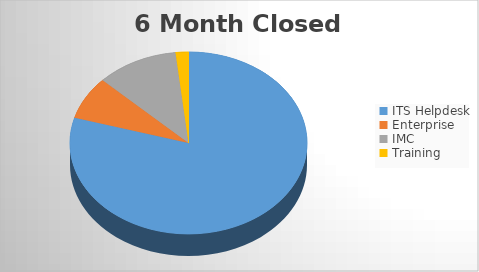
| Category | 6M Closed | 6M Opened |
|---|---|---|
| ITS Helpdesk | 1355 | 1418 |
| Enterprise | 130 | 148 |
| IMC | 190 | 206 |
| Training | 30 | 46 |